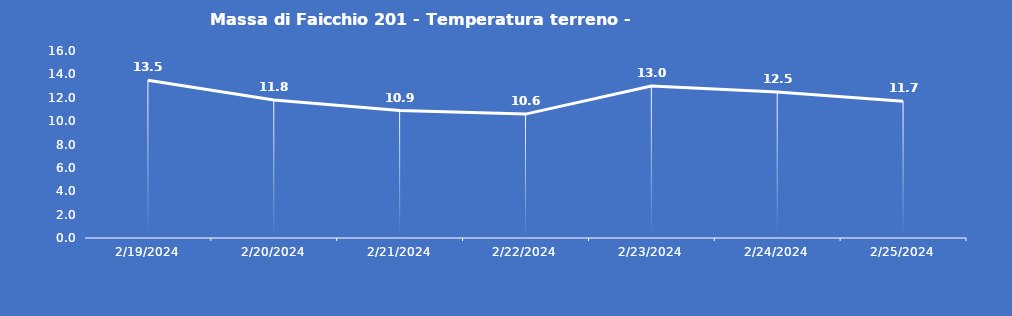
| Category | Massa di Faicchio 201 - Temperatura terreno - Grezzo (°C) |
|---|---|
| 2/19/24 | 13.5 |
| 2/20/24 | 11.8 |
| 2/21/24 | 10.9 |
| 2/22/24 | 10.6 |
| 2/23/24 | 13 |
| 2/24/24 | 12.5 |
| 2/25/24 | 11.7 |